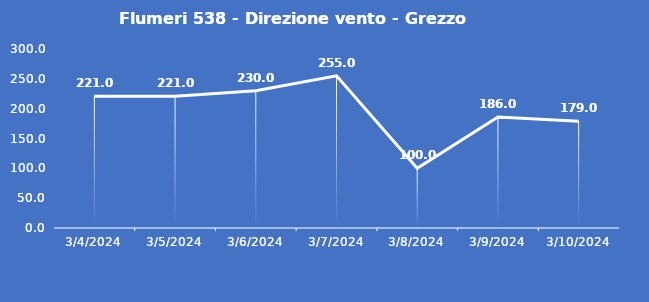
| Category | Flumeri 538 - Direzione vento - Grezzo (°N) |
|---|---|
| 3/4/24 | 221 |
| 3/5/24 | 221 |
| 3/6/24 | 230 |
| 3/7/24 | 255 |
| 3/8/24 | 100 |
| 3/9/24 | 186 |
| 3/10/24 | 179 |